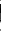
| Category | Series 0 |
|---|---|
| 0 | -0.95 |
| 1 | -1.65 |
| 2 | -2.63 |
| 3 | -3.25 |
| 4 | -3.34 |
| 5 | -3.81 |